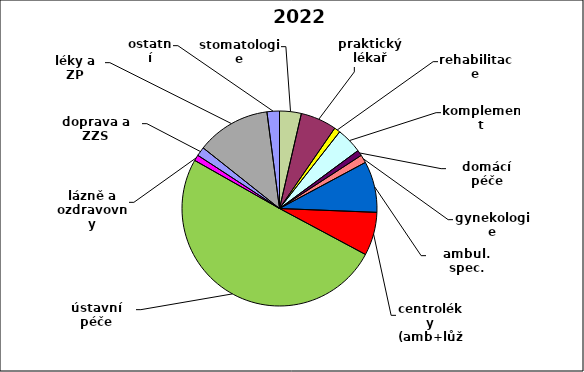
| Category | Series 0 |
|---|---|
| stomatologie | 0.036 |
| praktický lékař | 0.06 |
| rehabilitace | 0.01 |
| komplement | 0.043 |
| domácí péče | 0.009 |
| gynekologie | 0.013 |
| ambul. spec. | 0.085 |
| centroléky (amb+lůž) | 0.072 |
| ústavní péče | 0.504 |
| lázně a ozdravovny | 0.01 |
| doprava a ZZS | 0.015 |
| léky a ZP | 0.123 |
| ostatní | 0.021 |